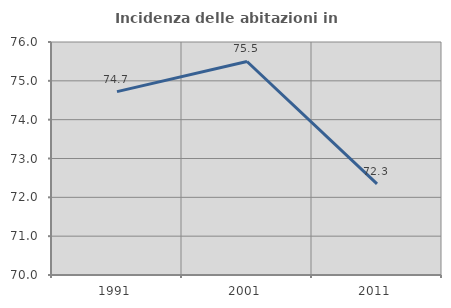
| Category | Incidenza delle abitazioni in proprietà  |
|---|---|
| 1991.0 | 74.722 |
| 2001.0 | 75.499 |
| 2011.0 | 72.346 |